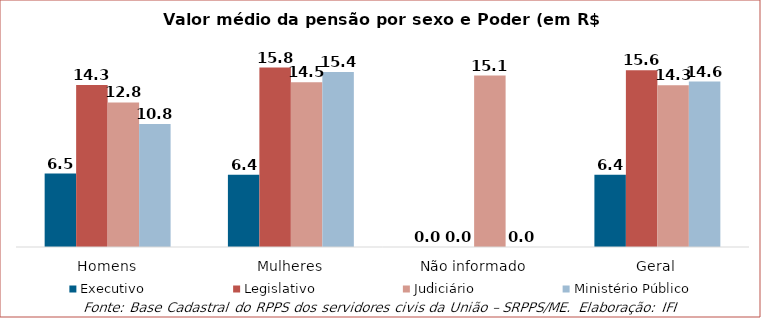
| Category | Executivo | Legislativo | Judiciário | Ministério Público |
|---|---|---|---|---|
| Homens | 6475.688 | 14299.402 | 12761.009 | 10845.679 |
| Mulheres | 6369.124 | 15831.934 | 14528.054 | 15447.583 |
| Não informado | 0 | 0 | 15128.199 | 0 |
| Geral | 6379.736 | 15598.96 | 14281.454 | 14602.228 |